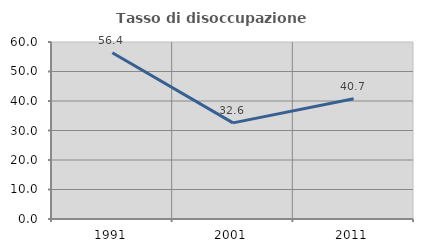
| Category | Tasso di disoccupazione giovanile  |
|---|---|
| 1991.0 | 56.354 |
| 2001.0 | 32.584 |
| 2011.0 | 40.741 |